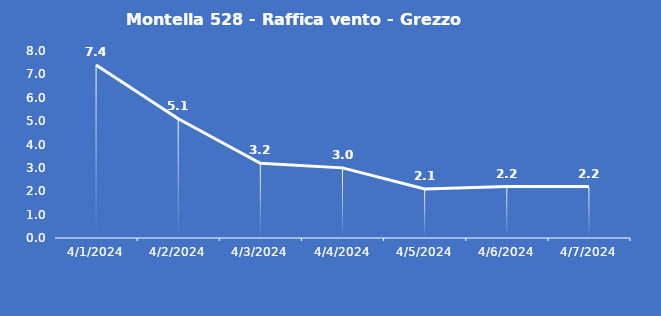
| Category | Montella 528 - Raffica vento - Grezzo (m/s) |
|---|---|
| 4/1/24 | 7.4 |
| 4/2/24 | 5.1 |
| 4/3/24 | 3.2 |
| 4/4/24 | 3 |
| 4/5/24 | 2.1 |
| 4/6/24 | 2.2 |
| 4/7/24 | 2.2 |